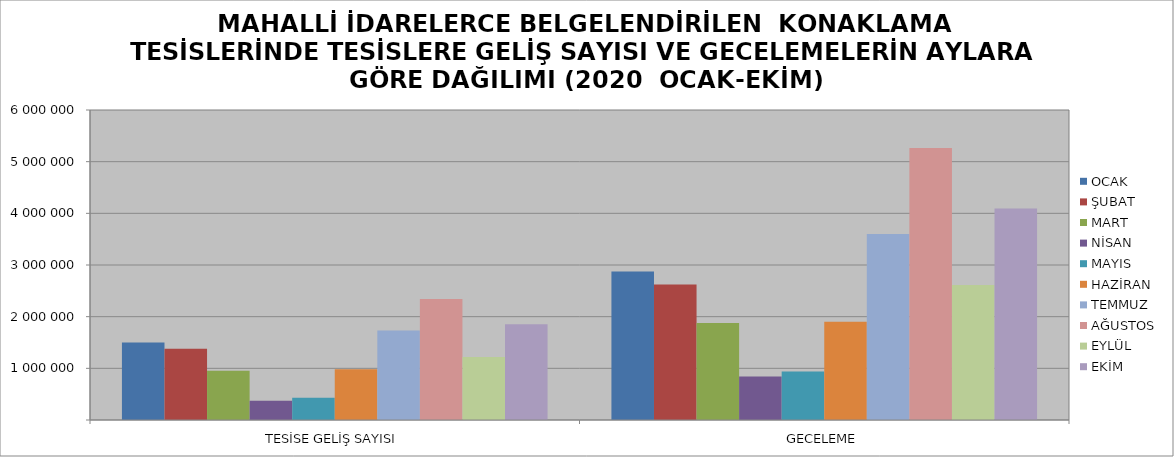
| Category | OCAK | ŞUBAT | MART | NİSAN | MAYIS | HAZİRAN | TEMMUZ | AĞUSTOS | EYLÜL | EKİM |
|---|---|---|---|---|---|---|---|---|---|---|
| TESİSE GELİŞ SAYISI | 1497815 | 1380765 | 955554 | 372466 | 430328 | 981538 | 1730606 | 2342031 | 1217037 | 1851250 |
| GECELEME | 2872303 | 2621819 | 1878971 | 839735 | 939652 | 1902057 | 3601580 | 5263679 | 2612279 | 4093869 |